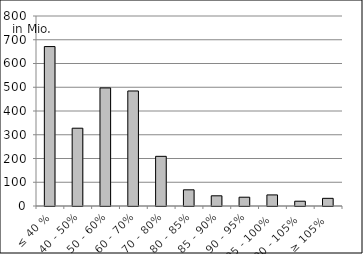
| Category | Volumen |
|---|---|
| ≤ 40 % | 671282629.842 |
| 40 - 50% | 327560069.341 |
| 50 - 60% | 497141963.646 |
| 60 - 70% | 484282943.683 |
| 70 - 80% | 209090817.967 |
| 80 - 85% | 68145089.947 |
| 85 - 90% | 42936413.322 |
| 90 - 95% | 37032650.149 |
| 95 - 100% | 46658602.593 |
| 100 - 105% | 20161560.176 |
| ≥ 105% | 32279187.195 |